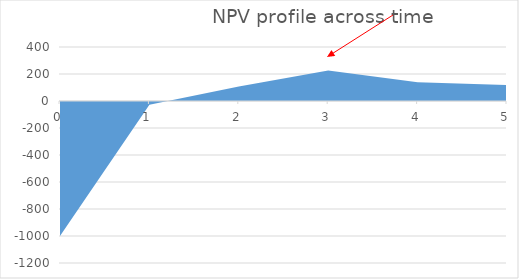
| Category | Series 0 |
|---|---|
| 0.0 | -1000 |
| 1.0 | -27.778 |
| 2.0 | 107.682 |
| 3.0 | 226.439 |
| 4.0 | 139.706 |
| 5.0 | 117.927 |